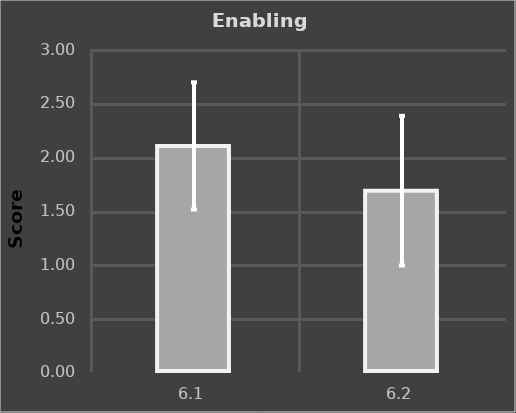
| Category | Male |
|---|---|
| 6.1 | 2.1 |
| 6.2 | 1.684 |